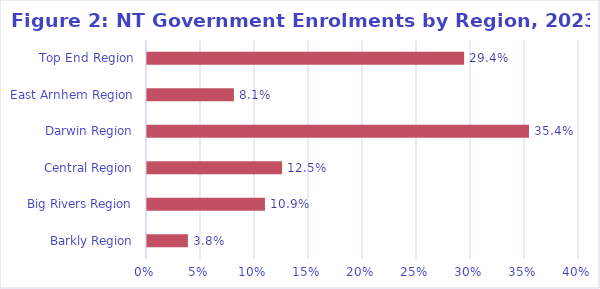
| Category | Series 0 |
|---|---|
| Barkly Region | 0.038 |
| Big Rivers Region | 0.109 |
| Central Region | 0.125 |
| Darwin Region | 0.354 |
| East Arnhem Region | 0.081 |
| Top End Region | 0.294 |